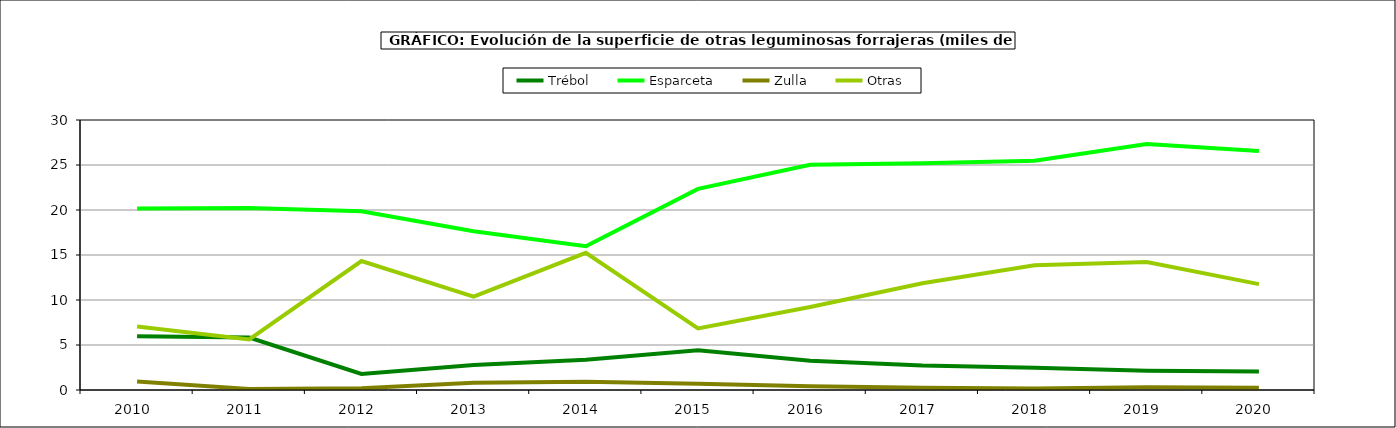
| Category | Trébol | Esparceta | Zulla | Otras |
|---|---|---|---|---|
| 2010.0 | 5.977 | 20.154 | 0.957 | 7.056 |
| 2011.0 | 5.836 | 20.216 | 0.117 | 5.61 |
| 2012.0 | 1.782 | 19.86 | 0.202 | 14.331 |
| 2013.0 | 2.77 | 17.645 | 0.8 | 10.366 |
| 2014.0 | 3.361 | 15.981 | 0.92 | 15.244 |
| 2015.0 | 4.404 | 22.35 | 0.693 | 6.846 |
| 2016.0 | 3.241 | 25.025 | 0.423 | 9.224 |
| 2017.0 | 2.711 | 25.183 | 0.247 | 11.87 |
| 2018.0 | 2.475 | 25.483 | 0.159 | 13.872 |
| 2019.0 | 2.143 | 27.326 | 0.31 | 14.21 |
| 2020.0 | 2.063 | 26.569 | 0.243 | 11.76 |